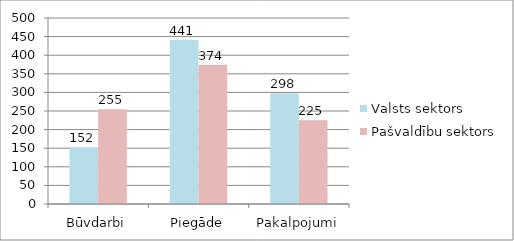
| Category | Valsts sektors | Pašvaldību sektors |
|---|---|---|
| Būvdarbi | 152 | 255 |
| Piegāde | 441 | 374 |
| Pakalpojumi | 298 | 225 |